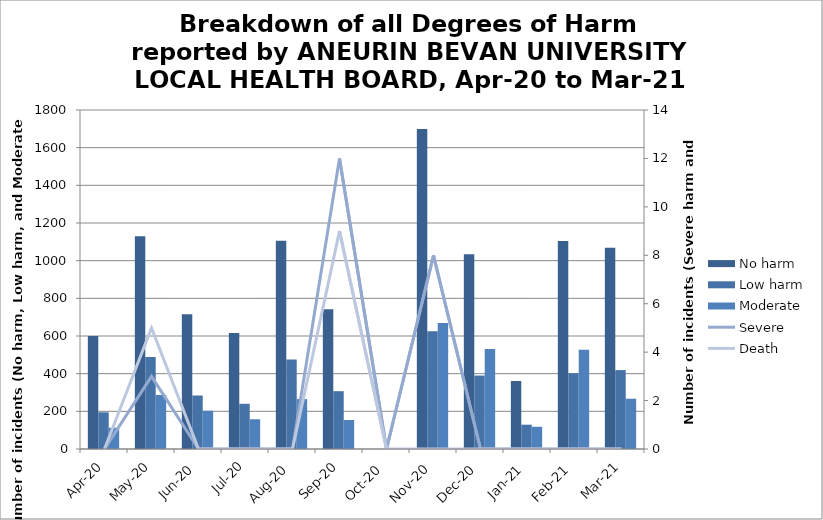
| Category | No harm | Low harm | Moderate |
|---|---|---|---|
| Apr-20 | 600 | 195 | 113 |
| May-20 | 1129 | 489 | 287 |
| Jun-20 | 715 | 284 | 203 |
| Jul-20 | 616 | 240 | 158 |
| Aug-20 | 1106 | 475 | 265 |
| Sep-20 | 742 | 307 | 154 |
| Oct-20 | 0 | 0 | 0 |
| Nov-20 | 1699 | 625 | 669 |
| Dec-20 | 1034 | 390 | 531 |
| Jan-21 | 361 | 129 | 118 |
| Feb-21 | 1104 | 402 | 527 |
| Mar-21 | 1069 | 419 | 267 |